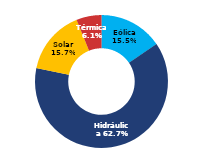
| Category | Sur |
|---|---|
| Eólica | 79.955 |
| Hidráulica | 323.782 |
| Solar | 80.833 |
| Térmica | 31.522 |